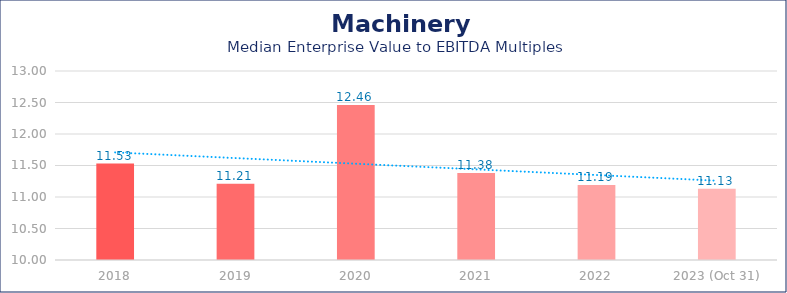
| Category | Machinery |
|---|---|
| 2018 | 11.53 |
| 2019 | 11.21 |
| 2020 | 12.46 |
| 2021 | 11.38 |
| 2022 | 11.19 |
| 2023 (Oct 31) | 11.13 |